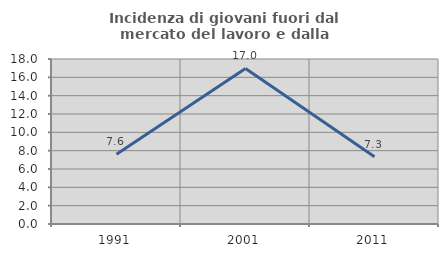
| Category | Incidenza di giovani fuori dal mercato del lavoro e dalla formazione  |
|---|---|
| 1991.0 | 7.614 |
| 2001.0 | 16.97 |
| 2011.0 | 7.333 |